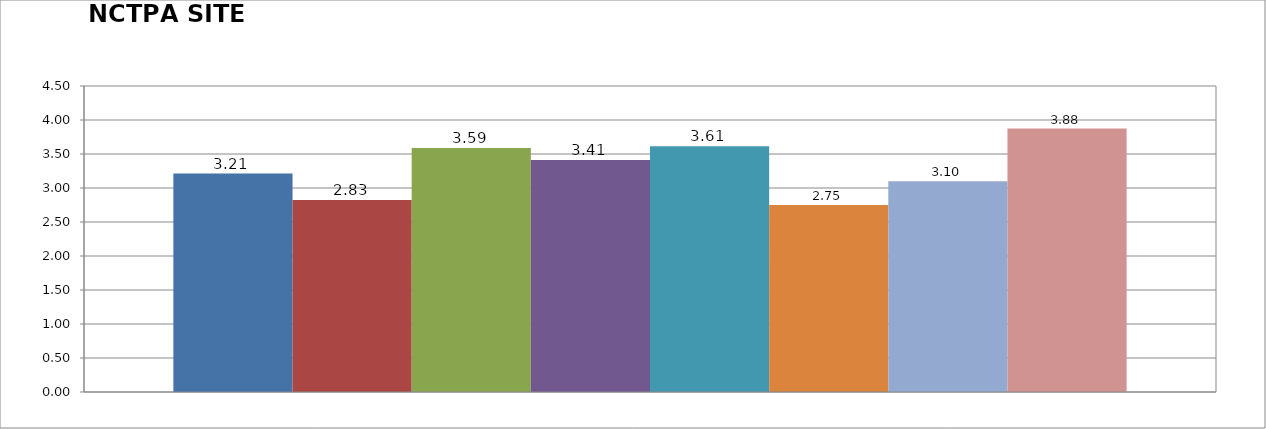
| Category | Circlepoint | Coros | Green Media | Fluid NRG | MIG | KHB | The Mechanism | Green Ideas |
|---|---|---|---|---|---|---|---|---|
| 0 | 3.212 | 2.825 | 3.587 | 3.412 | 3.612 | 2.75 | 3.1 | 3.875 |